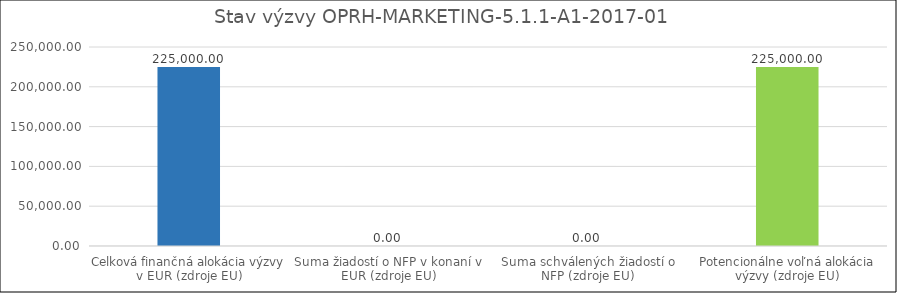
| Category | Stav výzvy OPRH-MARKETING-5.1.1-A1-2017-01   |
|---|---|
| Celková finančná alokácia výzvy v EUR (zdroje EU) | 225000 |
| Suma žiadostí o NFP v konaní v EUR (zdroje EU) | 0 |
| Suma schválených žiadostí o NFP (zdroje EU) | 0 |
| Potencionálne voľná alokácia výzvy (zdroje EU) | 225000 |